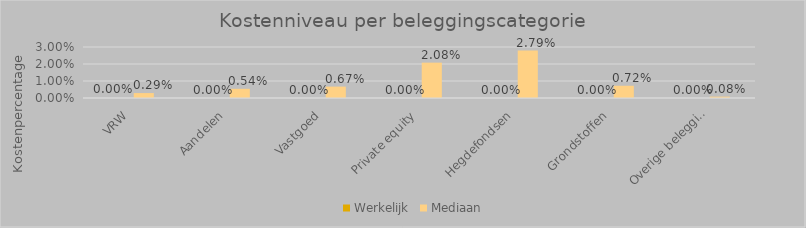
| Category | Werkelijk | Mediaan |
|---|---|---|
| VRW | 0 | 0.003 |
| Aandelen | 0 | 0.005 |
| Vastgoed | 0 | 0.007 |
| Private equity | 0 | 0.021 |
| Hegdefondsen | 0 | 0.028 |
| Grondstoffen | 0 | 0.007 |
| Overige beleggingskosten | 0 | 0.001 |